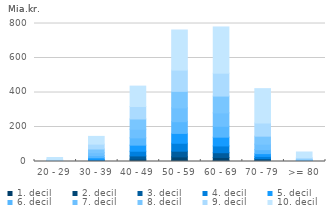
| Category | 1. decil | 2. decil | 3. decil | 4. decil | 5. decil | 6. decil | 7. decil | 8. decil | 9. decil | 10. decil |
|---|---|---|---|---|---|---|---|---|---|---|
| 20 - 29 | 0.02 | 0.08 | 0.17 | 0.32 | 0.58 | 1.03 | 1.76 | 2.97 | 5.12 | 11.03 |
| 30 - 39 | 0.31 | 1.78 | 3.91 | 6.44 | 9.36 | 12.71 | 16.61 | 21.43 | 28.09 | 44.94 |
| 40 - 49 | 3.03 | 10.5 | 18.73 | 27.38 | 35.11 | 42.37 | 50.08 | 59.23 | 72.49 | 118.07 |
| 50 - 59 | 6.97 | 19.82 | 33.08 | 45.86 | 57.07 | 67.96 | 80.03 | 95.91 | 123.26 | 232.3 |
| 60 - 69 | 6.43 | 17.12 | 27.42 | 39.19 | 50.89 | 63.18 | 77.48 | 97.62 | 132.76 | 267.79 |
| 70 - 79 | 2.16 | 6.19 | 9.13 | 11.99 | 16.25 | 22.85 | 31.86 | 46.49 | 76.2 | 199.15 |
| >= 80 | 0.08 | 0.46 | 0.86 | 1.33 | 1.85 | 2.47 | 3.22 | 4.38 | 8.25 | 32.11 |